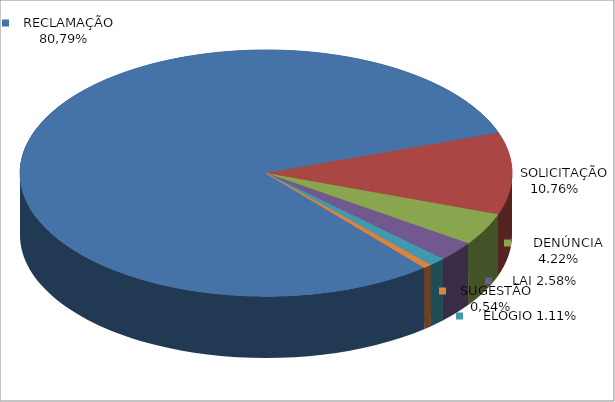
| Category | Series 0 |
|---|---|
|      RECLAMAÇÃO | 0.808 |
|      SOLICITAÇÃO | 0.108 |
|      DENÚNCIA | 0.042 |
|      LAI | 0.026 |
|      ELOGIO | 0.011 |
|      SUGESTÃO | 0.005 |